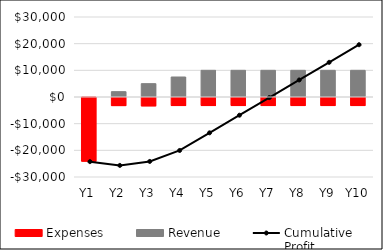
| Category | Expenses | Revenue |
|---|---|---|
| Y1 | -24240 | 0 |
| Y2 | -3410 | 2000 |
| Y3 | -3510 | 5000 |
| Y4 | -3390 | 7500 |
| Y5 | -3390 | 10000 |
| Y6 | -3390 | 10000 |
| Y7 | -3390 | 10000 |
| Y8 | -3390 | 10000 |
| Y9 | -3390 | 10000 |
| Y10 | -3390 | 10000 |